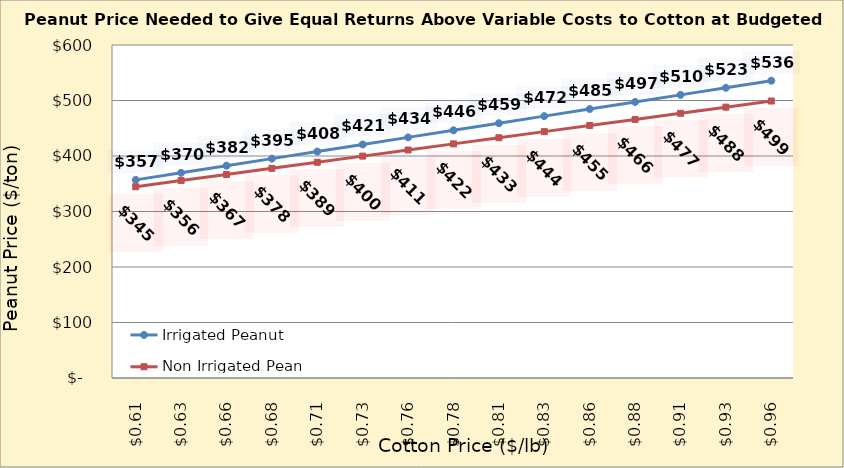
| Category | Irrigated Peanut | Non Irrigated Peanut |
|---|---|---|
| 0.6049999999999999 | 356.955 | 344.643 |
| 0.6299999999999999 | 369.721 | 355.672 |
| 0.6549999999999999 | 382.487 | 366.702 |
| 0.6799999999999999 | 395.252 | 377.731 |
| 0.705 | 408.018 | 388.76 |
| 0.73 | 420.784 | 399.79 |
| 0.755 | 433.55 | 410.819 |
| 0.78 | 446.316 | 421.849 |
| 0.805 | 459.082 | 432.878 |
| 0.8300000000000001 | 471.848 | 443.907 |
| 0.8550000000000001 | 484.614 | 454.937 |
| 0.8800000000000001 | 497.38 | 465.966 |
| 0.9050000000000001 | 510.146 | 476.996 |
| 0.9300000000000002 | 522.912 | 488.025 |
| 0.9550000000000002 | 535.678 | 499.054 |